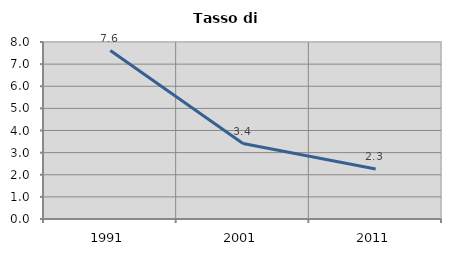
| Category | Tasso di disoccupazione   |
|---|---|
| 1991.0 | 7.614 |
| 2001.0 | 3.409 |
| 2011.0 | 2.256 |